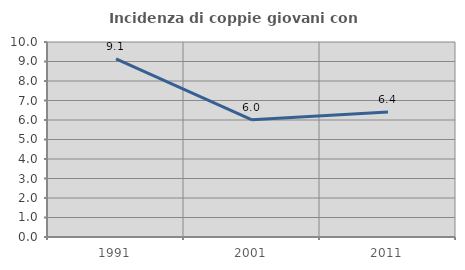
| Category | Incidenza di coppie giovani con figli |
|---|---|
| 1991.0 | 9.132 |
| 2001.0 | 6.011 |
| 2011.0 | 6.41 |